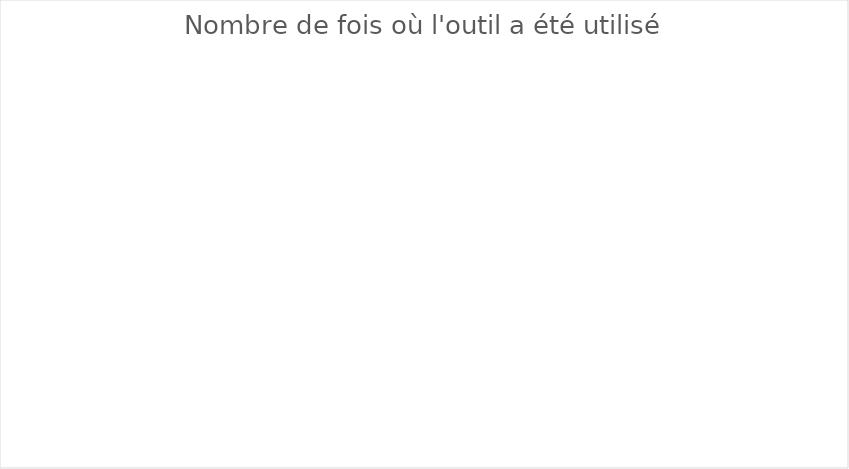
| Category | Series 0 |
|---|---|
| Interactions médicamenteuses (BDM issue du LAP) | 0 |
| Ajustement à la fonction rénale (exemple GPR ) | 0 |
| Risque allongment QT (exemple crediblemeds) | 0 |
| Charge anticholinergique (OMéDIT PDL) | 0 |
| 1 ligne de traitement = existence d'un symptome ou maladie | 0 |
| Forta  | 0 |
| Stopp and Start | 0 |
| Pimcheck | 0 |
| Observance (Questionnaire de Girerd) | 0 |
| Autre | 0 |